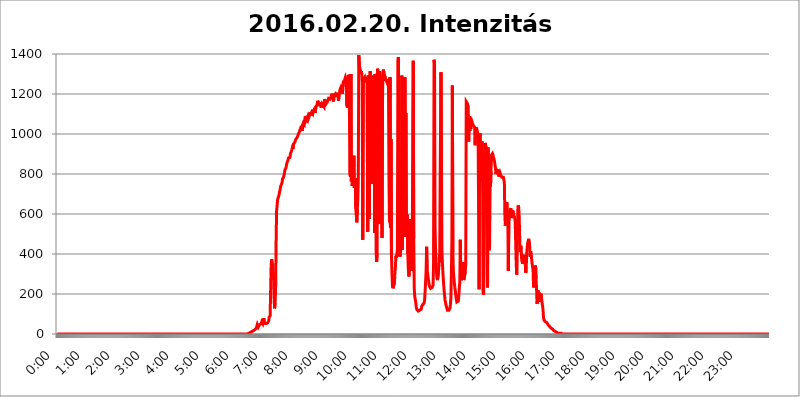
| Category | 2016.02.20. Intenzitás [W/m^2] |
|---|---|
| 0.0 | 0 |
| 0.0006944444444444445 | 0 |
| 0.001388888888888889 | 0 |
| 0.0020833333333333333 | 0 |
| 0.002777777777777778 | 0 |
| 0.003472222222222222 | 0 |
| 0.004166666666666667 | 0 |
| 0.004861111111111111 | 0 |
| 0.005555555555555556 | 0 |
| 0.0062499999999999995 | 0 |
| 0.006944444444444444 | 0 |
| 0.007638888888888889 | 0 |
| 0.008333333333333333 | 0 |
| 0.009027777777777779 | 0 |
| 0.009722222222222222 | 0 |
| 0.010416666666666666 | 0 |
| 0.011111111111111112 | 0 |
| 0.011805555555555555 | 0 |
| 0.012499999999999999 | 0 |
| 0.013194444444444444 | 0 |
| 0.013888888888888888 | 0 |
| 0.014583333333333332 | 0 |
| 0.015277777777777777 | 0 |
| 0.015972222222222224 | 0 |
| 0.016666666666666666 | 0 |
| 0.017361111111111112 | 0 |
| 0.018055555555555557 | 0 |
| 0.01875 | 0 |
| 0.019444444444444445 | 0 |
| 0.02013888888888889 | 0 |
| 0.020833333333333332 | 0 |
| 0.02152777777777778 | 0 |
| 0.022222222222222223 | 0 |
| 0.02291666666666667 | 0 |
| 0.02361111111111111 | 0 |
| 0.024305555555555556 | 0 |
| 0.024999999999999998 | 0 |
| 0.025694444444444447 | 0 |
| 0.02638888888888889 | 0 |
| 0.027083333333333334 | 0 |
| 0.027777777777777776 | 0 |
| 0.02847222222222222 | 0 |
| 0.029166666666666664 | 0 |
| 0.029861111111111113 | 0 |
| 0.030555555555555555 | 0 |
| 0.03125 | 0 |
| 0.03194444444444445 | 0 |
| 0.03263888888888889 | 0 |
| 0.03333333333333333 | 0 |
| 0.034027777777777775 | 0 |
| 0.034722222222222224 | 0 |
| 0.035416666666666666 | 0 |
| 0.036111111111111115 | 0 |
| 0.03680555555555556 | 0 |
| 0.0375 | 0 |
| 0.03819444444444444 | 0 |
| 0.03888888888888889 | 0 |
| 0.03958333333333333 | 0 |
| 0.04027777777777778 | 0 |
| 0.04097222222222222 | 0 |
| 0.041666666666666664 | 0 |
| 0.042361111111111106 | 0 |
| 0.04305555555555556 | 0 |
| 0.043750000000000004 | 0 |
| 0.044444444444444446 | 0 |
| 0.04513888888888889 | 0 |
| 0.04583333333333334 | 0 |
| 0.04652777777777778 | 0 |
| 0.04722222222222222 | 0 |
| 0.04791666666666666 | 0 |
| 0.04861111111111111 | 0 |
| 0.049305555555555554 | 0 |
| 0.049999999999999996 | 0 |
| 0.05069444444444445 | 0 |
| 0.051388888888888894 | 0 |
| 0.052083333333333336 | 0 |
| 0.05277777777777778 | 0 |
| 0.05347222222222222 | 0 |
| 0.05416666666666667 | 0 |
| 0.05486111111111111 | 0 |
| 0.05555555555555555 | 0 |
| 0.05625 | 0 |
| 0.05694444444444444 | 0 |
| 0.057638888888888885 | 0 |
| 0.05833333333333333 | 0 |
| 0.05902777777777778 | 0 |
| 0.059722222222222225 | 0 |
| 0.06041666666666667 | 0 |
| 0.061111111111111116 | 0 |
| 0.06180555555555556 | 0 |
| 0.0625 | 0 |
| 0.06319444444444444 | 0 |
| 0.06388888888888888 | 0 |
| 0.06458333333333334 | 0 |
| 0.06527777777777778 | 0 |
| 0.06597222222222222 | 0 |
| 0.06666666666666667 | 0 |
| 0.06736111111111111 | 0 |
| 0.06805555555555555 | 0 |
| 0.06874999999999999 | 0 |
| 0.06944444444444443 | 0 |
| 0.07013888888888889 | 0 |
| 0.07083333333333333 | 0 |
| 0.07152777777777779 | 0 |
| 0.07222222222222223 | 0 |
| 0.07291666666666667 | 0 |
| 0.07361111111111111 | 0 |
| 0.07430555555555556 | 0 |
| 0.075 | 0 |
| 0.07569444444444444 | 0 |
| 0.0763888888888889 | 0 |
| 0.07708333333333334 | 0 |
| 0.07777777777777778 | 0 |
| 0.07847222222222222 | 0 |
| 0.07916666666666666 | 0 |
| 0.0798611111111111 | 0 |
| 0.08055555555555556 | 0 |
| 0.08125 | 0 |
| 0.08194444444444444 | 0 |
| 0.08263888888888889 | 0 |
| 0.08333333333333333 | 0 |
| 0.08402777777777777 | 0 |
| 0.08472222222222221 | 0 |
| 0.08541666666666665 | 0 |
| 0.08611111111111112 | 0 |
| 0.08680555555555557 | 0 |
| 0.08750000000000001 | 0 |
| 0.08819444444444445 | 0 |
| 0.08888888888888889 | 0 |
| 0.08958333333333333 | 0 |
| 0.09027777777777778 | 0 |
| 0.09097222222222222 | 0 |
| 0.09166666666666667 | 0 |
| 0.09236111111111112 | 0 |
| 0.09305555555555556 | 0 |
| 0.09375 | 0 |
| 0.09444444444444444 | 0 |
| 0.09513888888888888 | 0 |
| 0.09583333333333333 | 0 |
| 0.09652777777777777 | 0 |
| 0.09722222222222222 | 0 |
| 0.09791666666666667 | 0 |
| 0.09861111111111111 | 0 |
| 0.09930555555555555 | 0 |
| 0.09999999999999999 | 0 |
| 0.10069444444444443 | 0 |
| 0.1013888888888889 | 0 |
| 0.10208333333333335 | 0 |
| 0.10277777777777779 | 0 |
| 0.10347222222222223 | 0 |
| 0.10416666666666667 | 0 |
| 0.10486111111111111 | 0 |
| 0.10555555555555556 | 0 |
| 0.10625 | 0 |
| 0.10694444444444444 | 0 |
| 0.1076388888888889 | 0 |
| 0.10833333333333334 | 0 |
| 0.10902777777777778 | 0 |
| 0.10972222222222222 | 0 |
| 0.1111111111111111 | 0 |
| 0.11180555555555556 | 0 |
| 0.11180555555555556 | 0 |
| 0.1125 | 0 |
| 0.11319444444444444 | 0 |
| 0.11388888888888889 | 0 |
| 0.11458333333333333 | 0 |
| 0.11527777777777777 | 0 |
| 0.11597222222222221 | 0 |
| 0.11666666666666665 | 0 |
| 0.1173611111111111 | 0 |
| 0.11805555555555557 | 0 |
| 0.11944444444444445 | 0 |
| 0.12013888888888889 | 0 |
| 0.12083333333333333 | 0 |
| 0.12152777777777778 | 0 |
| 0.12222222222222223 | 0 |
| 0.12291666666666667 | 0 |
| 0.12291666666666667 | 0 |
| 0.12361111111111112 | 0 |
| 0.12430555555555556 | 0 |
| 0.125 | 0 |
| 0.12569444444444444 | 0 |
| 0.12638888888888888 | 0 |
| 0.12708333333333333 | 0 |
| 0.16875 | 0 |
| 0.12847222222222224 | 0 |
| 0.12916666666666668 | 0 |
| 0.12986111111111112 | 0 |
| 0.13055555555555556 | 0 |
| 0.13125 | 0 |
| 0.13194444444444445 | 0 |
| 0.1326388888888889 | 0 |
| 0.13333333333333333 | 0 |
| 0.13402777777777777 | 0 |
| 0.13402777777777777 | 0 |
| 0.13472222222222222 | 0 |
| 0.13541666666666666 | 0 |
| 0.1361111111111111 | 0 |
| 0.13749999999999998 | 0 |
| 0.13819444444444443 | 0 |
| 0.1388888888888889 | 0 |
| 0.13958333333333334 | 0 |
| 0.14027777777777778 | 0 |
| 0.14097222222222222 | 0 |
| 0.14166666666666666 | 0 |
| 0.1423611111111111 | 0 |
| 0.14305555555555557 | 0 |
| 0.14375000000000002 | 0 |
| 0.14444444444444446 | 0 |
| 0.1451388888888889 | 0 |
| 0.1451388888888889 | 0 |
| 0.14652777777777778 | 0 |
| 0.14722222222222223 | 0 |
| 0.14791666666666667 | 0 |
| 0.1486111111111111 | 0 |
| 0.14930555555555555 | 0 |
| 0.15 | 0 |
| 0.15069444444444444 | 0 |
| 0.15138888888888888 | 0 |
| 0.15208333333333332 | 0 |
| 0.15277777777777776 | 0 |
| 0.15347222222222223 | 0 |
| 0.15416666666666667 | 0 |
| 0.15486111111111112 | 0 |
| 0.15555555555555556 | 0 |
| 0.15625 | 0 |
| 0.15694444444444444 | 0 |
| 0.15763888888888888 | 0 |
| 0.15833333333333333 | 0 |
| 0.15902777777777777 | 0 |
| 0.15972222222222224 | 0 |
| 0.16041666666666668 | 0 |
| 0.16111111111111112 | 0 |
| 0.16180555555555556 | 0 |
| 0.1625 | 0 |
| 0.16319444444444445 | 0 |
| 0.1638888888888889 | 0 |
| 0.16458333333333333 | 0 |
| 0.16527777777777777 | 0 |
| 0.16597222222222222 | 0 |
| 0.16666666666666666 | 0 |
| 0.1673611111111111 | 0 |
| 0.16805555555555554 | 0 |
| 0.16874999999999998 | 0 |
| 0.16944444444444443 | 0 |
| 0.17013888888888887 | 0 |
| 0.1708333333333333 | 0 |
| 0.17152777777777775 | 0 |
| 0.17222222222222225 | 0 |
| 0.1729166666666667 | 0 |
| 0.17361111111111113 | 0 |
| 0.17430555555555557 | 0 |
| 0.17500000000000002 | 0 |
| 0.17569444444444446 | 0 |
| 0.1763888888888889 | 0 |
| 0.17708333333333334 | 0 |
| 0.17777777777777778 | 0 |
| 0.17847222222222223 | 0 |
| 0.17916666666666667 | 0 |
| 0.1798611111111111 | 0 |
| 0.18055555555555555 | 0 |
| 0.18125 | 0 |
| 0.18194444444444444 | 0 |
| 0.1826388888888889 | 0 |
| 0.18333333333333335 | 0 |
| 0.1840277777777778 | 0 |
| 0.18472222222222223 | 0 |
| 0.18541666666666667 | 0 |
| 0.18611111111111112 | 0 |
| 0.18680555555555556 | 0 |
| 0.1875 | 0 |
| 0.18819444444444444 | 0 |
| 0.18888888888888888 | 0 |
| 0.18958333333333333 | 0 |
| 0.19027777777777777 | 0 |
| 0.1909722222222222 | 0 |
| 0.19166666666666665 | 0 |
| 0.19236111111111112 | 0 |
| 0.19305555555555554 | 0 |
| 0.19375 | 0 |
| 0.19444444444444445 | 0 |
| 0.1951388888888889 | 0 |
| 0.19583333333333333 | 0 |
| 0.19652777777777777 | 0 |
| 0.19722222222222222 | 0 |
| 0.19791666666666666 | 0 |
| 0.1986111111111111 | 0 |
| 0.19930555555555554 | 0 |
| 0.19999999999999998 | 0 |
| 0.20069444444444443 | 0 |
| 0.20138888888888887 | 0 |
| 0.2020833333333333 | 0 |
| 0.2027777777777778 | 0 |
| 0.2034722222222222 | 0 |
| 0.2041666666666667 | 0 |
| 0.20486111111111113 | 0 |
| 0.20555555555555557 | 0 |
| 0.20625000000000002 | 0 |
| 0.20694444444444446 | 0 |
| 0.2076388888888889 | 0 |
| 0.20833333333333334 | 0 |
| 0.20902777777777778 | 0 |
| 0.20972222222222223 | 0 |
| 0.21041666666666667 | 0 |
| 0.2111111111111111 | 0 |
| 0.21180555555555555 | 0 |
| 0.2125 | 0 |
| 0.21319444444444444 | 0 |
| 0.2138888888888889 | 0 |
| 0.21458333333333335 | 0 |
| 0.2152777777777778 | 0 |
| 0.21597222222222223 | 0 |
| 0.21666666666666667 | 0 |
| 0.21736111111111112 | 0 |
| 0.21805555555555556 | 0 |
| 0.21875 | 0 |
| 0.21944444444444444 | 0 |
| 0.22013888888888888 | 0 |
| 0.22083333333333333 | 0 |
| 0.22152777777777777 | 0 |
| 0.2222222222222222 | 0 |
| 0.22291666666666665 | 0 |
| 0.2236111111111111 | 0 |
| 0.22430555555555556 | 0 |
| 0.225 | 0 |
| 0.22569444444444445 | 0 |
| 0.2263888888888889 | 0 |
| 0.22708333333333333 | 0 |
| 0.22777777777777777 | 0 |
| 0.22847222222222222 | 0 |
| 0.22916666666666666 | 0 |
| 0.2298611111111111 | 0 |
| 0.23055555555555554 | 0 |
| 0.23124999999999998 | 0 |
| 0.23194444444444443 | 0 |
| 0.23263888888888887 | 0 |
| 0.2333333333333333 | 0 |
| 0.2340277777777778 | 0 |
| 0.2347222222222222 | 0 |
| 0.2354166666666667 | 0 |
| 0.23611111111111113 | 0 |
| 0.23680555555555557 | 0 |
| 0.23750000000000002 | 0 |
| 0.23819444444444446 | 0 |
| 0.2388888888888889 | 0 |
| 0.23958333333333334 | 0 |
| 0.24027777777777778 | 0 |
| 0.24097222222222223 | 0 |
| 0.24166666666666667 | 0 |
| 0.2423611111111111 | 0 |
| 0.24305555555555555 | 0 |
| 0.24375 | 0 |
| 0.24444444444444446 | 0 |
| 0.24513888888888888 | 0 |
| 0.24583333333333335 | 0 |
| 0.2465277777777778 | 0 |
| 0.24722222222222223 | 0 |
| 0.24791666666666667 | 0 |
| 0.24861111111111112 | 0 |
| 0.24930555555555556 | 0 |
| 0.25 | 0 |
| 0.25069444444444444 | 0 |
| 0.2513888888888889 | 0 |
| 0.2520833333333333 | 0 |
| 0.25277777777777777 | 0 |
| 0.2534722222222222 | 0 |
| 0.25416666666666665 | 0 |
| 0.2548611111111111 | 0 |
| 0.2555555555555556 | 0 |
| 0.25625000000000003 | 0 |
| 0.2569444444444445 | 0 |
| 0.2576388888888889 | 0 |
| 0.25833333333333336 | 0 |
| 0.2590277777777778 | 0 |
| 0.25972222222222224 | 0 |
| 0.2604166666666667 | 0 |
| 0.2611111111111111 | 0 |
| 0.26180555555555557 | 0 |
| 0.2625 | 0 |
| 0.26319444444444445 | 0 |
| 0.2638888888888889 | 0 |
| 0.26458333333333334 | 0 |
| 0.2652777777777778 | 0 |
| 0.2659722222222222 | 0 |
| 0.26666666666666666 | 0 |
| 0.2673611111111111 | 0 |
| 0.26805555555555555 | 0 |
| 0.26875 | 3.525 |
| 0.26944444444444443 | 3.525 |
| 0.2701388888888889 | 3.525 |
| 0.2708333333333333 | 7.887 |
| 0.27152777777777776 | 7.887 |
| 0.2722222222222222 | 12.257 |
| 0.27291666666666664 | 12.257 |
| 0.2736111111111111 | 12.257 |
| 0.2743055555555555 | 16.636 |
| 0.27499999999999997 | 16.636 |
| 0.27569444444444446 | 16.636 |
| 0.27638888888888885 | 16.636 |
| 0.27708333333333335 | 21.024 |
| 0.2777777777777778 | 21.024 |
| 0.27847222222222223 | 25.419 |
| 0.2791666666666667 | 29.823 |
| 0.2798611111111111 | 38.653 |
| 0.28055555555555556 | 47.511 |
| 0.28125 | 43.079 |
| 0.28194444444444444 | 34.234 |
| 0.2826388888888889 | 34.234 |
| 0.2833333333333333 | 38.653 |
| 0.28402777777777777 | 47.511 |
| 0.2847222222222222 | 47.511 |
| 0.28541666666666665 | 47.511 |
| 0.28611111111111115 | 51.951 |
| 0.28680555555555554 | 60.85 |
| 0.28750000000000003 | 56.398 |
| 0.2881944444444445 | 51.951 |
| 0.2888888888888889 | 65.31 |
| 0.28958333333333336 | 78.722 |
| 0.2902777777777778 | 65.31 |
| 0.29097222222222224 | 51.951 |
| 0.2916666666666667 | 51.951 |
| 0.2923611111111111 | 51.951 |
| 0.29305555555555557 | 51.951 |
| 0.29375 | 56.398 |
| 0.29444444444444445 | 56.398 |
| 0.2951388888888889 | 56.398 |
| 0.29583333333333334 | 56.398 |
| 0.2965277777777778 | 65.31 |
| 0.2972222222222222 | 83.205 |
| 0.29791666666666666 | 87.692 |
| 0.2986111111111111 | 92.184 |
| 0.29930555555555555 | 223.873 |
| 0.3 | 337.639 |
| 0.30069444444444443 | 373.729 |
| 0.3013888888888889 | 360.221 |
| 0.3020833333333333 | 346.682 |
| 0.30277777777777776 | 342.162 |
| 0.3034722222222222 | 269.49 |
| 0.30416666666666664 | 178.264 |
| 0.3048611111111111 | 128.284 |
| 0.3055555555555555 | 155.509 |
| 0.30624999999999997 | 223.873 |
| 0.3069444444444444 | 458.38 |
| 0.3076388888888889 | 613.252 |
| 0.30833333333333335 | 642.4 |
| 0.3090277777777778 | 671.22 |
| 0.30972222222222223 | 679.395 |
| 0.3104166666666667 | 683.473 |
| 0.3111111111111111 | 695.666 |
| 0.31180555555555556 | 711.832 |
| 0.3125 | 719.877 |
| 0.31319444444444444 | 735.89 |
| 0.3138888888888889 | 743.859 |
| 0.3145833333333333 | 747.834 |
| 0.31527777777777777 | 755.766 |
| 0.3159722222222222 | 775.492 |
| 0.31666666666666665 | 775.492 |
| 0.31736111111111115 | 783.342 |
| 0.31805555555555554 | 795.074 |
| 0.31875000000000003 | 806.757 |
| 0.3194444444444445 | 822.26 |
| 0.3201388888888889 | 826.123 |
| 0.32083333333333336 | 829.981 |
| 0.3215277777777778 | 845.365 |
| 0.32222222222222224 | 856.855 |
| 0.3229166666666667 | 856.855 |
| 0.3236111111111111 | 868.305 |
| 0.32430555555555557 | 879.719 |
| 0.325 | 883.516 |
| 0.32569444444444445 | 879.719 |
| 0.3263888888888889 | 883.516 |
| 0.32708333333333334 | 902.447 |
| 0.3277777777777778 | 902.447 |
| 0.3284722222222222 | 913.766 |
| 0.32916666666666666 | 917.534 |
| 0.3298611111111111 | 932.576 |
| 0.33055555555555555 | 925.06 |
| 0.33125 | 947.58 |
| 0.33194444444444443 | 947.58 |
| 0.3326388888888889 | 951.327 |
| 0.3333333333333333 | 958.814 |
| 0.3340277777777778 | 970.034 |
| 0.3347222222222222 | 970.034 |
| 0.3354166666666667 | 977.508 |
| 0.3361111111111111 | 973.772 |
| 0.3368055555555556 | 984.98 |
| 0.33749999999999997 | 992.448 |
| 0.33819444444444446 | 999.916 |
| 0.33888888888888885 | 999.916 |
| 0.33958333333333335 | 1011.118 |
| 0.34027777777777773 | 1018.587 |
| 0.34097222222222223 | 1014.852 |
| 0.3416666666666666 | 1022.323 |
| 0.3423611111111111 | 1041.019 |
| 0.3430555555555555 | 1022.323 |
| 0.34375 | 1014.852 |
| 0.3444444444444445 | 1048.508 |
| 0.3451388888888889 | 1056.004 |
| 0.3458333333333334 | 1052.255 |
| 0.34652777777777777 | 1048.508 |
| 0.34722222222222227 | 1071.027 |
| 0.34791666666666665 | 1089.873 |
| 0.34861111111111115 | 1086.097 |
| 0.34930555555555554 | 1086.097 |
| 0.35000000000000003 | 1071.027 |
| 0.3506944444444444 | 1078.555 |
| 0.3513888888888889 | 1086.097 |
| 0.3520833333333333 | 1074.789 |
| 0.3527777777777778 | 1082.324 |
| 0.3534722222222222 | 1089.873 |
| 0.3541666666666667 | 1101.226 |
| 0.3548611111111111 | 1108.816 |
| 0.35555555555555557 | 1093.653 |
| 0.35625 | 1093.653 |
| 0.35694444444444445 | 1108.816 |
| 0.3576388888888889 | 1108.816 |
| 0.35833333333333334 | 1101.226 |
| 0.3590277777777778 | 1116.426 |
| 0.3597222222222222 | 1116.426 |
| 0.36041666666666666 | 1124.056 |
| 0.3611111111111111 | 1124.056 |
| 0.36180555555555555 | 1105.019 |
| 0.3625 | 1127.879 |
| 0.36319444444444443 | 1139.384 |
| 0.3638888888888889 | 1135.543 |
| 0.3645833333333333 | 1147.086 |
| 0.3652777777777778 | 1166.46 |
| 0.3659722222222222 | 1158.689 |
| 0.3666666666666667 | 1147.086 |
| 0.3673611111111111 | 1147.086 |
| 0.3680555555555556 | 1143.232 |
| 0.36874999999999997 | 1150.946 |
| 0.36944444444444446 | 1147.086 |
| 0.37013888888888885 | 1131.708 |
| 0.37083333333333335 | 1131.708 |
| 0.37152777777777773 | 1150.946 |
| 0.37222222222222223 | 1150.946 |
| 0.3729166666666666 | 1143.232 |
| 0.3736111111111111 | 1139.384 |
| 0.3743055555555555 | 1135.543 |
| 0.375 | 1174.263 |
| 0.3756944444444445 | 1178.177 |
| 0.3763888888888889 | 1174.263 |
| 0.3770833333333334 | 1150.946 |
| 0.37777777777777777 | 1150.946 |
| 0.37847222222222227 | 1150.946 |
| 0.37916666666666665 | 1162.571 |
| 0.37986111111111115 | 1158.689 |
| 0.38055555555555554 | 1178.177 |
| 0.38125000000000003 | 1178.177 |
| 0.3819444444444444 | 1174.263 |
| 0.3826388888888889 | 1174.263 |
| 0.3833333333333333 | 1174.263 |
| 0.3840277777777778 | 1186.03 |
| 0.3847222222222222 | 1193.918 |
| 0.3854166666666667 | 1201.843 |
| 0.3861111111111111 | 1189.969 |
| 0.38680555555555557 | 1170.358 |
| 0.3875 | 1162.571 |
| 0.38819444444444445 | 1193.918 |
| 0.3888888888888889 | 1197.876 |
| 0.38958333333333334 | 1189.969 |
| 0.3902777777777778 | 1201.843 |
| 0.3909722222222222 | 1205.82 |
| 0.39166666666666666 | 1193.918 |
| 0.3923611111111111 | 1186.03 |
| 0.39305555555555555 | 1205.82 |
| 0.39375 | 1189.969 |
| 0.39444444444444443 | 1166.46 |
| 0.3951388888888889 | 1193.918 |
| 0.3958333333333333 | 1201.843 |
| 0.3965277777777778 | 1221.83 |
| 0.3972222222222222 | 1225.859 |
| 0.3979166666666667 | 1233.951 |
| 0.3986111111111111 | 1225.859 |
| 0.3993055555555556 | 1217.812 |
| 0.39999999999999997 | 1201.843 |
| 0.40069444444444446 | 1242.089 |
| 0.40138888888888885 | 1266.8 |
| 0.40208333333333335 | 1258.511 |
| 0.40277777777777773 | 1262.649 |
| 0.40347222222222223 | 1275.142 |
| 0.4041666666666666 | 1283.541 |
| 0.4048611111111111 | 1275.142 |
| 0.4055555555555555 | 1283.541 |
| 0.40625 | 1139.384 |
| 0.4069444444444445 | 1131.708 |
| 0.4076388888888889 | 1275.142 |
| 0.4083333333333334 | 1296.248 |
| 0.40902777777777777 | 1287.761 |
| 0.40972222222222227 | 1150.946 |
| 0.41041666666666665 | 806.757 |
| 0.41111111111111115 | 787.258 |
| 0.41180555555555554 | 1300.514 |
| 0.41250000000000003 | 763.674 |
| 0.4131944444444444 | 868.305 |
| 0.4138888888888889 | 739.877 |
| 0.4145833333333333 | 856.855 |
| 0.4152777777777778 | 763.674 |
| 0.4159722222222222 | 891.099 |
| 0.4166666666666667 | 731.896 |
| 0.4173611111111111 | 767.62 |
| 0.41805555555555557 | 779.42 |
| 0.41875 | 625.784 |
| 0.41944444444444445 | 592.233 |
| 0.4201388888888889 | 558.261 |
| 0.42083333333333334 | 625.784 |
| 0.4215277777777778 | 671.22 |
| 0.4222222222222222 | 771.559 |
| 0.42291666666666666 | 1394.106 |
| 0.4236111111111111 | 1344.072 |
| 0.42430555555555555 | 1330.826 |
| 0.425 | 1322.082 |
| 0.42569444444444443 | 1304.795 |
| 0.4263888888888889 | 1313.406 |
| 0.4270833333333333 | 1300.514 |
| 0.4277777777777778 | 1258.511 |
| 0.4284722222222222 | 471.582 |
| 0.4291666666666667 | 1262.649 |
| 0.4298611111111111 | 1275.142 |
| 0.4305555555555556 | 1279.334 |
| 0.43124999999999997 | 1283.541 |
| 0.43194444444444446 | 1270.964 |
| 0.43263888888888885 | 1258.511 |
| 0.43333333333333335 | 1283.541 |
| 0.43402777777777773 | 1270.964 |
| 0.43472222222222223 | 1279.334 |
| 0.4354166666666666 | 510.885 |
| 0.4361111111111111 | 1291.997 |
| 0.4368055555555555 | 1270.964 |
| 0.4375 | 575.299 |
| 0.4381944444444445 | 1225.859 |
| 0.4388888888888889 | 1313.406 |
| 0.4395833333333334 | 1258.511 |
| 0.44027777777777777 | 1258.511 |
| 0.44097222222222227 | 751.803 |
| 0.44166666666666665 | 1254.387 |
| 0.44236111111111115 | 1291.997 |
| 0.44305555555555554 | 1296.248 |
| 0.44375000000000003 | 1246.176 |
| 0.4444444444444444 | 1283.541 |
| 0.4451388888888889 | 506.542 |
| 0.4458333333333333 | 1300.514 |
| 0.4465277777777778 | 1279.334 |
| 0.4472222222222222 | 414.035 |
| 0.4479166666666667 | 360.221 |
| 0.4486111111111111 | 400.638 |
| 0.44930555555555557 | 1326.445 |
| 0.45 | 1300.514 |
| 0.45069444444444445 | 600.661 |
| 0.4513888888888889 | 549.704 |
| 0.45208333333333334 | 1313.406 |
| 0.4527777777777778 | 1317.736 |
| 0.4534722222222222 | 1275.142 |
| 0.45416666666666666 | 1178.177 |
| 0.4548611111111111 | 751.803 |
| 0.45555555555555555 | 480.356 |
| 0.45625 | 1209.807 |
| 0.45694444444444443 | 1313.406 |
| 0.4576388888888889 | 1322.082 |
| 0.4583333333333333 | 1270.964 |
| 0.4590277777777778 | 1296.248 |
| 0.4597222222222222 | 1266.8 |
| 0.4604166666666667 | 1279.334 |
| 0.4611111111111111 | 1279.334 |
| 0.4618055555555556 | 1275.142 |
| 0.46249999999999997 | 1258.511 |
| 0.46319444444444446 | 1262.649 |
| 0.46388888888888885 | 1275.142 |
| 0.46458333333333335 | 1262.649 |
| 0.46527777777777773 | 771.559 |
| 0.46597222222222223 | 558.261 |
| 0.4666666666666666 | 1283.541 |
| 0.4673611111111111 | 532.513 |
| 0.4680555555555555 | 973.772 |
| 0.46875 | 396.164 |
| 0.4694444444444445 | 305.898 |
| 0.4701388888888889 | 242.127 |
| 0.4708333333333334 | 228.436 |
| 0.47152777777777777 | 233 |
| 0.47222222222222227 | 228.436 |
| 0.47291666666666665 | 255.813 |
| 0.47361111111111115 | 305.898 |
| 0.47430555555555554 | 337.639 |
| 0.47500000000000003 | 391.685 |
| 0.4756944444444444 | 382.715 |
| 0.4763888888888889 | 396.164 |
| 0.4770833333333333 | 427.39 |
| 0.4777777777777778 | 1361.991 |
| 0.4784722222222222 | 1384.828 |
| 0.4791666666666667 | 409.574 |
| 0.4798611111111111 | 427.39 |
| 0.48055555555555557 | 387.202 |
| 0.48125 | 400.638 |
| 0.48194444444444445 | 427.39 |
| 0.4826388888888889 | 523.88 |
| 0.48333333333333334 | 1291.997 |
| 0.4840277777777778 | 422.943 |
| 0.4847222222222222 | 418.492 |
| 0.48541666666666666 | 1108.816 |
| 0.4861111111111111 | 917.534 |
| 0.48680555555555555 | 484.735 |
| 0.4875 | 1283.541 |
| 0.48819444444444443 | 609.062 |
| 0.4888888888888889 | 1105.019 |
| 0.4895833333333333 | 592.233 |
| 0.4902777777777778 | 502.192 |
| 0.4909722222222222 | 596.45 |
| 0.4916666666666667 | 400.638 |
| 0.4923611111111111 | 328.584 |
| 0.4930555555555556 | 287.709 |
| 0.49374999999999997 | 305.898 |
| 0.49444444444444446 | 427.39 |
| 0.49513888888888885 | 575.299 |
| 0.49583333333333335 | 364.728 |
| 0.49652777777777773 | 342.162 |
| 0.49722222222222223 | 314.98 |
| 0.4979166666666666 | 337.639 |
| 0.4986111111111111 | 1067.267 |
| 0.4993055555555555 | 1366.519 |
| 0.5 | 480.356 |
| 0.5006944444444444 | 228.436 |
| 0.5013888888888889 | 187.378 |
| 0.5020833333333333 | 173.709 |
| 0.5027777777777778 | 160.056 |
| 0.5034722222222222 | 137.347 |
| 0.5041666666666667 | 123.758 |
| 0.5048611111111111 | 119.235 |
| 0.5055555555555555 | 119.235 |
| 0.50625 | 114.716 |
| 0.5069444444444444 | 119.235 |
| 0.5076388888888889 | 119.235 |
| 0.5083333333333333 | 119.235 |
| 0.5090277777777777 | 119.235 |
| 0.5097222222222222 | 119.235 |
| 0.5104166666666666 | 123.758 |
| 0.5111111111111112 | 137.347 |
| 0.5118055555555555 | 141.884 |
| 0.5125000000000001 | 146.423 |
| 0.5131944444444444 | 146.423 |
| 0.513888888888889 | 150.964 |
| 0.5145833333333333 | 155.509 |
| 0.5152777777777778 | 173.709 |
| 0.5159722222222222 | 214.746 |
| 0.5166666666666667 | 264.932 |
| 0.517361111111111 | 319.517 |
| 0.5180555555555556 | 436.27 |
| 0.5187499999999999 | 314.98 |
| 0.5194444444444445 | 305.898 |
| 0.5201388888888888 | 283.156 |
| 0.5208333333333334 | 264.932 |
| 0.5215277777777778 | 246.689 |
| 0.5222222222222223 | 237.564 |
| 0.5229166666666667 | 242.127 |
| 0.5236111111111111 | 228.436 |
| 0.5243055555555556 | 223.873 |
| 0.525 | 233 |
| 0.5256944444444445 | 233 |
| 0.5263888888888889 | 228.436 |
| 0.5270833333333333 | 242.127 |
| 0.5277777777777778 | 355.712 |
| 0.5284722222222222 | 1371.066 |
| 0.5291666666666667 | 1352.994 |
| 0.5298611111111111 | 536.82 |
| 0.5305555555555556 | 431.833 |
| 0.53125 | 360.221 |
| 0.5319444444444444 | 305.898 |
| 0.5326388888888889 | 278.603 |
| 0.5333333333333333 | 269.49 |
| 0.5340277777777778 | 274.047 |
| 0.5347222222222222 | 314.98 |
| 0.5354166666666667 | 342.162 |
| 0.5361111111111111 | 396.164 |
| 0.5368055555555555 | 360.221 |
| 0.5375 | 984.98 |
| 0.5381944444444444 | 1309.093 |
| 0.5388888888888889 | 802.868 |
| 0.5395833333333333 | 409.574 |
| 0.5402777777777777 | 351.198 |
| 0.5409722222222222 | 301.354 |
| 0.5416666666666666 | 264.932 |
| 0.5423611111111112 | 228.436 |
| 0.5430555555555555 | 201.058 |
| 0.5437500000000001 | 173.709 |
| 0.5444444444444444 | 160.056 |
| 0.545138888888889 | 146.423 |
| 0.5458333333333333 | 137.347 |
| 0.5465277777777778 | 128.284 |
| 0.5472222222222222 | 119.235 |
| 0.5479166666666667 | 119.235 |
| 0.548611111111111 | 119.235 |
| 0.5493055555555556 | 119.235 |
| 0.5499999999999999 | 119.235 |
| 0.5506944444444445 | 128.284 |
| 0.5513888888888888 | 146.423 |
| 0.5520833333333334 | 178.264 |
| 0.5527777777777778 | 296.808 |
| 0.5534722222222223 | 462.786 |
| 0.5541666666666667 | 1242.089 |
| 0.5548611111111111 | 409.574 |
| 0.5555555555555556 | 314.98 |
| 0.55625 | 283.156 |
| 0.5569444444444445 | 255.813 |
| 0.5576388888888889 | 233 |
| 0.5583333333333333 | 214.746 |
| 0.5590277777777778 | 191.937 |
| 0.5597222222222222 | 173.709 |
| 0.5604166666666667 | 160.056 |
| 0.5611111111111111 | 155.509 |
| 0.5618055555555556 | 155.509 |
| 0.5625 | 164.605 |
| 0.5631944444444444 | 191.937 |
| 0.5638888888888889 | 228.436 |
| 0.5645833333333333 | 260.373 |
| 0.5652777777777778 | 471.582 |
| 0.5659722222222222 | 292.259 |
| 0.5666666666666667 | 269.49 |
| 0.5673611111111111 | 278.603 |
| 0.5680555555555555 | 278.603 |
| 0.56875 | 274.047 |
| 0.5694444444444444 | 360.221 |
| 0.5701388888888889 | 269.49 |
| 0.5708333333333333 | 269.49 |
| 0.5715277777777777 | 274.047 |
| 0.5722222222222222 | 310.44 |
| 0.5729166666666666 | 351.198 |
| 0.5736111111111112 | 1162.571 |
| 0.5743055555555555 | 1166.46 |
| 0.5750000000000001 | 1154.814 |
| 0.5756944444444444 | 1154.814 |
| 0.576388888888889 | 1139.384 |
| 0.5770833333333333 | 962.555 |
| 0.5777777777777778 | 1089.873 |
| 0.5784722222222222 | 1014.852 |
| 0.5791666666666667 | 1078.555 |
| 0.579861111111111 | 1026.06 |
| 0.5805555555555556 | 1059.756 |
| 0.5812499999999999 | 1067.267 |
| 0.5819444444444445 | 1059.756 |
| 0.5826388888888888 | 1048.508 |
| 0.5833333333333334 | 1044.762 |
| 0.5840277777777778 | 1041.019 |
| 0.5847222222222223 | 1037.277 |
| 0.5854166666666667 | 1033.537 |
| 0.5861111111111111 | 943.832 |
| 0.5868055555555556 | 1033.537 |
| 0.5875 | 1011.118 |
| 0.5881944444444445 | 1014.852 |
| 0.5888888888888889 | 1018.587 |
| 0.5895833333333333 | 1007.383 |
| 0.5902777777777778 | 999.916 |
| 0.5909722222222222 | 617.436 |
| 0.5916666666666667 | 223.873 |
| 0.5923611111111111 | 984.98 |
| 0.5930555555555556 | 1003.65 |
| 0.59375 | 759.723 |
| 0.5944444444444444 | 947.58 |
| 0.5951388888888889 | 925.06 |
| 0.5958333333333333 | 962.555 |
| 0.5965277777777778 | 845.365 |
| 0.5972222222222222 | 205.62 |
| 0.5979166666666667 | 196.497 |
| 0.5986111111111111 | 201.058 |
| 0.5993055555555555 | 763.674 |
| 0.6 | 955.071 |
| 0.6006944444444444 | 947.58 |
| 0.6013888888888889 | 936.33 |
| 0.6020833333333333 | 932.576 |
| 0.6027777777777777 | 917.534 |
| 0.6034722222222222 | 233 |
| 0.6041666666666666 | 932.576 |
| 0.6048611111111112 | 719.877 |
| 0.6055555555555555 | 621.613 |
| 0.6062500000000001 | 418.492 |
| 0.6069444444444444 | 879.719 |
| 0.607638888888889 | 735.89 |
| 0.6083333333333333 | 814.519 |
| 0.6090277777777778 | 894.885 |
| 0.6097222222222222 | 891.099 |
| 0.6104166666666667 | 902.447 |
| 0.611111111111111 | 894.885 |
| 0.6118055555555556 | 894.885 |
| 0.6124999999999999 | 875.918 |
| 0.6131944444444445 | 864.493 |
| 0.6138888888888888 | 864.493 |
| 0.6145833333333334 | 829.981 |
| 0.6152777777777778 | 798.974 |
| 0.6159722222222223 | 802.868 |
| 0.6166666666666667 | 818.392 |
| 0.6173611111111111 | 814.519 |
| 0.6180555555555556 | 810.641 |
| 0.61875 | 822.26 |
| 0.6194444444444445 | 787.258 |
| 0.6201388888888889 | 798.974 |
| 0.6208333333333333 | 806.757 |
| 0.6215277777777778 | 798.974 |
| 0.6222222222222222 | 798.974 |
| 0.6229166666666667 | 795.074 |
| 0.6236111111111111 | 783.342 |
| 0.6243055555555556 | 783.342 |
| 0.625 | 787.258 |
| 0.6256944444444444 | 783.342 |
| 0.6263888888888889 | 771.559 |
| 0.6270833333333333 | 755.766 |
| 0.6277777777777778 | 596.45 |
| 0.6284722222222222 | 541.121 |
| 0.6291666666666667 | 566.793 |
| 0.6298611111111111 | 617.436 |
| 0.6305555555555555 | 658.909 |
| 0.63125 | 600.661 |
| 0.6319444444444444 | 588.009 |
| 0.6326388888888889 | 314.98 |
| 0.6333333333333333 | 553.986 |
| 0.6340277777777777 | 579.542 |
| 0.6347222222222222 | 592.233 |
| 0.6354166666666666 | 592.233 |
| 0.6361111111111112 | 629.948 |
| 0.6368055555555555 | 592.233 |
| 0.6375000000000001 | 579.542 |
| 0.6381944444444444 | 579.542 |
| 0.638888888888889 | 617.436 |
| 0.6395833333333333 | 617.436 |
| 0.6402777777777778 | 592.233 |
| 0.6409722222222222 | 588.009 |
| 0.6416666666666667 | 583.779 |
| 0.642361111111111 | 553.986 |
| 0.6430555555555556 | 445.129 |
| 0.6437499999999999 | 346.682 |
| 0.6444444444444445 | 296.808 |
| 0.6451388888888888 | 566.793 |
| 0.6458333333333334 | 545.416 |
| 0.6465277777777778 | 642.4 |
| 0.6472222222222223 | 634.105 |
| 0.6479166666666667 | 583.779 |
| 0.6486111111111111 | 471.582 |
| 0.6493055555555556 | 409.574 |
| 0.65 | 440.702 |
| 0.6506944444444445 | 427.39 |
| 0.6513888888888889 | 369.23 |
| 0.6520833333333333 | 364.728 |
| 0.6527777777777778 | 351.198 |
| 0.6534722222222222 | 364.728 |
| 0.6541666666666667 | 382.715 |
| 0.6548611111111111 | 382.715 |
| 0.6555555555555556 | 396.164 |
| 0.65625 | 369.23 |
| 0.6569444444444444 | 305.898 |
| 0.6576388888888889 | 314.98 |
| 0.6583333333333333 | 396.164 |
| 0.6590277777777778 | 427.39 |
| 0.6597222222222222 | 453.968 |
| 0.6604166666666667 | 462.786 |
| 0.6611111111111111 | 475.972 |
| 0.6618055555555555 | 471.582 |
| 0.6625 | 440.702 |
| 0.6631944444444444 | 387.202 |
| 0.6638888888888889 | 414.035 |
| 0.6645833333333333 | 418.492 |
| 0.6652777777777777 | 378.224 |
| 0.6659722222222222 | 351.198 |
| 0.6666666666666666 | 337.639 |
| 0.6673611111111111 | 319.517 |
| 0.6680555555555556 | 233 |
| 0.6687500000000001 | 233 |
| 0.6694444444444444 | 233 |
| 0.6701388888888888 | 301.354 |
| 0.6708333333333334 | 342.162 |
| 0.6715277777777778 | 274.047 |
| 0.6722222222222222 | 228.436 |
| 0.6729166666666666 | 150.964 |
| 0.6736111111111112 | 169.156 |
| 0.6743055555555556 | 219.309 |
| 0.6749999999999999 | 182.82 |
| 0.6756944444444444 | 160.056 |
| 0.6763888888888889 | 205.62 |
| 0.6770833333333334 | 201.058 |
| 0.6777777777777777 | 191.937 |
| 0.6784722222222223 | 201.058 |
| 0.6791666666666667 | 182.82 |
| 0.6798611111111111 | 160.056 |
| 0.6805555555555555 | 155.509 |
| 0.68125 | 123.758 |
| 0.6819444444444445 | 83.205 |
| 0.6826388888888889 | 69.775 |
| 0.6833333333333332 | 65.31 |
| 0.6840277777777778 | 65.31 |
| 0.6847222222222222 | 60.85 |
| 0.6854166666666667 | 56.398 |
| 0.686111111111111 | 56.398 |
| 0.6868055555555556 | 56.398 |
| 0.6875 | 51.951 |
| 0.6881944444444444 | 47.511 |
| 0.688888888888889 | 43.079 |
| 0.6895833333333333 | 43.079 |
| 0.6902777777777778 | 38.653 |
| 0.6909722222222222 | 34.234 |
| 0.6916666666666668 | 34.234 |
| 0.6923611111111111 | 29.823 |
| 0.6930555555555555 | 29.823 |
| 0.69375 | 25.419 |
| 0.6944444444444445 | 25.419 |
| 0.6951388888888889 | 21.024 |
| 0.6958333333333333 | 21.024 |
| 0.6965277777777777 | 16.636 |
| 0.6972222222222223 | 16.636 |
| 0.6979166666666666 | 12.257 |
| 0.6986111111111111 | 12.257 |
| 0.6993055555555556 | 12.257 |
| 0.7000000000000001 | 7.887 |
| 0.7006944444444444 | 7.887 |
| 0.7013888888888888 | 7.887 |
| 0.7020833333333334 | 7.887 |
| 0.7027777777777778 | 3.525 |
| 0.7034722222222222 | 3.525 |
| 0.7041666666666666 | 3.525 |
| 0.7048611111111112 | 3.525 |
| 0.7055555555555556 | 3.525 |
| 0.7062499999999999 | 3.525 |
| 0.7069444444444444 | 3.525 |
| 0.7076388888888889 | 3.525 |
| 0.7083333333333334 | 0 |
| 0.7090277777777777 | 0 |
| 0.7097222222222223 | 0 |
| 0.7104166666666667 | 0 |
| 0.7111111111111111 | 0 |
| 0.7118055555555555 | 0 |
| 0.7125 | 0 |
| 0.7131944444444445 | 0 |
| 0.7138888888888889 | 0 |
| 0.7145833333333332 | 0 |
| 0.7152777777777778 | 0 |
| 0.7159722222222222 | 0 |
| 0.7166666666666667 | 0 |
| 0.717361111111111 | 0 |
| 0.7180555555555556 | 0 |
| 0.71875 | 0 |
| 0.7194444444444444 | 0 |
| 0.720138888888889 | 0 |
| 0.7208333333333333 | 0 |
| 0.7215277777777778 | 0 |
| 0.7222222222222222 | 0 |
| 0.7229166666666668 | 0 |
| 0.7236111111111111 | 0 |
| 0.7243055555555555 | 0 |
| 0.725 | 0 |
| 0.7256944444444445 | 0 |
| 0.7263888888888889 | 0 |
| 0.7270833333333333 | 0 |
| 0.7277777777777777 | 0 |
| 0.7284722222222223 | 0 |
| 0.7291666666666666 | 0 |
| 0.7298611111111111 | 0 |
| 0.7305555555555556 | 0 |
| 0.7312500000000001 | 0 |
| 0.7319444444444444 | 0 |
| 0.7326388888888888 | 0 |
| 0.7333333333333334 | 0 |
| 0.7340277777777778 | 0 |
| 0.7347222222222222 | 0 |
| 0.7354166666666666 | 0 |
| 0.7361111111111112 | 0 |
| 0.7368055555555556 | 0 |
| 0.7374999999999999 | 0 |
| 0.7381944444444444 | 0 |
| 0.7388888888888889 | 0 |
| 0.7395833333333334 | 0 |
| 0.7402777777777777 | 0 |
| 0.7409722222222223 | 0 |
| 0.7416666666666667 | 0 |
| 0.7423611111111111 | 0 |
| 0.7430555555555555 | 0 |
| 0.74375 | 0 |
| 0.7444444444444445 | 0 |
| 0.7451388888888889 | 0 |
| 0.7458333333333332 | 0 |
| 0.7465277777777778 | 0 |
| 0.7472222222222222 | 0 |
| 0.7479166666666667 | 0 |
| 0.748611111111111 | 0 |
| 0.7493055555555556 | 0 |
| 0.75 | 0 |
| 0.7506944444444444 | 0 |
| 0.751388888888889 | 0 |
| 0.7520833333333333 | 0 |
| 0.7527777777777778 | 0 |
| 0.7534722222222222 | 0 |
| 0.7541666666666668 | 0 |
| 0.7548611111111111 | 0 |
| 0.7555555555555555 | 0 |
| 0.75625 | 0 |
| 0.7569444444444445 | 0 |
| 0.7576388888888889 | 0 |
| 0.7583333333333333 | 0 |
| 0.7590277777777777 | 0 |
| 0.7597222222222223 | 0 |
| 0.7604166666666666 | 0 |
| 0.7611111111111111 | 0 |
| 0.7618055555555556 | 0 |
| 0.7625000000000001 | 0 |
| 0.7631944444444444 | 0 |
| 0.7638888888888888 | 0 |
| 0.7645833333333334 | 0 |
| 0.7652777777777778 | 0 |
| 0.7659722222222222 | 0 |
| 0.7666666666666666 | 0 |
| 0.7673611111111112 | 0 |
| 0.7680555555555556 | 0 |
| 0.7687499999999999 | 0 |
| 0.7694444444444444 | 0 |
| 0.7701388888888889 | 0 |
| 0.7708333333333334 | 0 |
| 0.7715277777777777 | 0 |
| 0.7722222222222223 | 0 |
| 0.7729166666666667 | 0 |
| 0.7736111111111111 | 0 |
| 0.7743055555555555 | 0 |
| 0.775 | 0 |
| 0.7756944444444445 | 0 |
| 0.7763888888888889 | 0 |
| 0.7770833333333332 | 0 |
| 0.7777777777777778 | 0 |
| 0.7784722222222222 | 0 |
| 0.7791666666666667 | 0 |
| 0.779861111111111 | 0 |
| 0.7805555555555556 | 0 |
| 0.78125 | 0 |
| 0.7819444444444444 | 0 |
| 0.782638888888889 | 0 |
| 0.7833333333333333 | 0 |
| 0.7840277777777778 | 0 |
| 0.7847222222222222 | 0 |
| 0.7854166666666668 | 0 |
| 0.7861111111111111 | 0 |
| 0.7868055555555555 | 0 |
| 0.7875 | 0 |
| 0.7881944444444445 | 0 |
| 0.7888888888888889 | 0 |
| 0.7895833333333333 | 0 |
| 0.7902777777777777 | 0 |
| 0.7909722222222223 | 0 |
| 0.7916666666666666 | 0 |
| 0.7923611111111111 | 0 |
| 0.7930555555555556 | 0 |
| 0.7937500000000001 | 0 |
| 0.7944444444444444 | 0 |
| 0.7951388888888888 | 0 |
| 0.7958333333333334 | 0 |
| 0.7965277777777778 | 0 |
| 0.7972222222222222 | 0 |
| 0.7979166666666666 | 0 |
| 0.7986111111111112 | 0 |
| 0.7993055555555556 | 0 |
| 0.7999999999999999 | 0 |
| 0.8006944444444444 | 0 |
| 0.8013888888888889 | 0 |
| 0.8020833333333334 | 0 |
| 0.8027777777777777 | 0 |
| 0.8034722222222223 | 0 |
| 0.8041666666666667 | 0 |
| 0.8048611111111111 | 0 |
| 0.8055555555555555 | 0 |
| 0.80625 | 0 |
| 0.8069444444444445 | 0 |
| 0.8076388888888889 | 0 |
| 0.8083333333333332 | 0 |
| 0.8090277777777778 | 0 |
| 0.8097222222222222 | 0 |
| 0.8104166666666667 | 0 |
| 0.811111111111111 | 0 |
| 0.8118055555555556 | 0 |
| 0.8125 | 0 |
| 0.8131944444444444 | 0 |
| 0.813888888888889 | 0 |
| 0.8145833333333333 | 0 |
| 0.8152777777777778 | 0 |
| 0.8159722222222222 | 0 |
| 0.8166666666666668 | 0 |
| 0.8173611111111111 | 0 |
| 0.8180555555555555 | 0 |
| 0.81875 | 0 |
| 0.8194444444444445 | 0 |
| 0.8201388888888889 | 0 |
| 0.8208333333333333 | 0 |
| 0.8215277777777777 | 0 |
| 0.8222222222222223 | 0 |
| 0.8229166666666666 | 0 |
| 0.8236111111111111 | 0 |
| 0.8243055555555556 | 0 |
| 0.8250000000000001 | 0 |
| 0.8256944444444444 | 0 |
| 0.8263888888888888 | 0 |
| 0.8270833333333334 | 0 |
| 0.8277777777777778 | 0 |
| 0.8284722222222222 | 0 |
| 0.8291666666666666 | 0 |
| 0.8298611111111112 | 0 |
| 0.8305555555555556 | 0 |
| 0.8312499999999999 | 0 |
| 0.8319444444444444 | 0 |
| 0.8326388888888889 | 0 |
| 0.8333333333333334 | 0 |
| 0.8340277777777777 | 0 |
| 0.8347222222222223 | 0 |
| 0.8354166666666667 | 0 |
| 0.8361111111111111 | 0 |
| 0.8368055555555555 | 0 |
| 0.8375 | 0 |
| 0.8381944444444445 | 0 |
| 0.8388888888888889 | 0 |
| 0.8395833333333332 | 0 |
| 0.8402777777777778 | 0 |
| 0.8409722222222222 | 0 |
| 0.8416666666666667 | 0 |
| 0.842361111111111 | 0 |
| 0.8430555555555556 | 0 |
| 0.84375 | 0 |
| 0.8444444444444444 | 0 |
| 0.845138888888889 | 0 |
| 0.8458333333333333 | 0 |
| 0.8465277777777778 | 0 |
| 0.8472222222222222 | 0 |
| 0.8479166666666668 | 0 |
| 0.8486111111111111 | 0 |
| 0.8493055555555555 | 0 |
| 0.85 | 0 |
| 0.8506944444444445 | 0 |
| 0.8513888888888889 | 0 |
| 0.8520833333333333 | 0 |
| 0.8527777777777777 | 0 |
| 0.8534722222222223 | 0 |
| 0.8541666666666666 | 0 |
| 0.8548611111111111 | 0 |
| 0.8555555555555556 | 0 |
| 0.8562500000000001 | 0 |
| 0.8569444444444444 | 0 |
| 0.8576388888888888 | 0 |
| 0.8583333333333334 | 0 |
| 0.8590277777777778 | 0 |
| 0.8597222222222222 | 0 |
| 0.8604166666666666 | 0 |
| 0.8611111111111112 | 0 |
| 0.8618055555555556 | 0 |
| 0.8624999999999999 | 0 |
| 0.8631944444444444 | 0 |
| 0.8638888888888889 | 0 |
| 0.8645833333333334 | 0 |
| 0.8652777777777777 | 0 |
| 0.8659722222222223 | 0 |
| 0.8666666666666667 | 0 |
| 0.8673611111111111 | 0 |
| 0.8680555555555555 | 0 |
| 0.86875 | 0 |
| 0.8694444444444445 | 0 |
| 0.8701388888888889 | 0 |
| 0.8708333333333332 | 0 |
| 0.8715277777777778 | 0 |
| 0.8722222222222222 | 0 |
| 0.8729166666666667 | 0 |
| 0.873611111111111 | 0 |
| 0.8743055555555556 | 0 |
| 0.875 | 0 |
| 0.8756944444444444 | 0 |
| 0.876388888888889 | 0 |
| 0.8770833333333333 | 0 |
| 0.8777777777777778 | 0 |
| 0.8784722222222222 | 0 |
| 0.8791666666666668 | 0 |
| 0.8798611111111111 | 0 |
| 0.8805555555555555 | 0 |
| 0.88125 | 0 |
| 0.8819444444444445 | 0 |
| 0.8826388888888889 | 0 |
| 0.8833333333333333 | 0 |
| 0.8840277777777777 | 0 |
| 0.8847222222222223 | 0 |
| 0.8854166666666666 | 0 |
| 0.8861111111111111 | 0 |
| 0.8868055555555556 | 0 |
| 0.8875000000000001 | 0 |
| 0.8881944444444444 | 0 |
| 0.8888888888888888 | 0 |
| 0.8895833333333334 | 0 |
| 0.8902777777777778 | 0 |
| 0.8909722222222222 | 0 |
| 0.8916666666666666 | 0 |
| 0.8923611111111112 | 0 |
| 0.8930555555555556 | 0 |
| 0.8937499999999999 | 0 |
| 0.8944444444444444 | 0 |
| 0.8951388888888889 | 0 |
| 0.8958333333333334 | 0 |
| 0.8965277777777777 | 0 |
| 0.8972222222222223 | 0 |
| 0.8979166666666667 | 0 |
| 0.8986111111111111 | 0 |
| 0.8993055555555555 | 0 |
| 0.9 | 0 |
| 0.9006944444444445 | 0 |
| 0.9013888888888889 | 0 |
| 0.9020833333333332 | 0 |
| 0.9027777777777778 | 0 |
| 0.9034722222222222 | 0 |
| 0.9041666666666667 | 0 |
| 0.904861111111111 | 0 |
| 0.9055555555555556 | 0 |
| 0.90625 | 0 |
| 0.9069444444444444 | 0 |
| 0.907638888888889 | 0 |
| 0.9083333333333333 | 0 |
| 0.9090277777777778 | 0 |
| 0.9097222222222222 | 0 |
| 0.9104166666666668 | 0 |
| 0.9111111111111111 | 0 |
| 0.9118055555555555 | 0 |
| 0.9125 | 0 |
| 0.9131944444444445 | 0 |
| 0.9138888888888889 | 0 |
| 0.9145833333333333 | 0 |
| 0.9152777777777777 | 0 |
| 0.9159722222222223 | 0 |
| 0.9166666666666666 | 0 |
| 0.9173611111111111 | 0 |
| 0.9180555555555556 | 0 |
| 0.9187500000000001 | 0 |
| 0.9194444444444444 | 0 |
| 0.9201388888888888 | 0 |
| 0.9208333333333334 | 0 |
| 0.9215277777777778 | 0 |
| 0.9222222222222222 | 0 |
| 0.9229166666666666 | 0 |
| 0.9236111111111112 | 0 |
| 0.9243055555555556 | 0 |
| 0.9249999999999999 | 0 |
| 0.9256944444444444 | 0 |
| 0.9263888888888889 | 0 |
| 0.9270833333333334 | 0 |
| 0.9277777777777777 | 0 |
| 0.9284722222222223 | 0 |
| 0.9291666666666667 | 0 |
| 0.9298611111111111 | 0 |
| 0.9305555555555555 | 0 |
| 0.93125 | 0 |
| 0.9319444444444445 | 0 |
| 0.9326388888888889 | 0 |
| 0.9333333333333332 | 0 |
| 0.9340277777777778 | 0 |
| 0.9347222222222222 | 0 |
| 0.9354166666666667 | 0 |
| 0.936111111111111 | 0 |
| 0.9368055555555556 | 0 |
| 0.9375 | 0 |
| 0.9381944444444444 | 0 |
| 0.938888888888889 | 0 |
| 0.9395833333333333 | 0 |
| 0.9402777777777778 | 0 |
| 0.9409722222222222 | 0 |
| 0.9416666666666668 | 0 |
| 0.9423611111111111 | 0 |
| 0.9430555555555555 | 0 |
| 0.94375 | 0 |
| 0.9444444444444445 | 0 |
| 0.9451388888888889 | 0 |
| 0.9458333333333333 | 0 |
| 0.9465277777777777 | 0 |
| 0.9472222222222223 | 0 |
| 0.9479166666666666 | 0 |
| 0.9486111111111111 | 0 |
| 0.9493055555555556 | 0 |
| 0.9500000000000001 | 0 |
| 0.9506944444444444 | 0 |
| 0.9513888888888888 | 0 |
| 0.9520833333333334 | 0 |
| 0.9527777777777778 | 0 |
| 0.9534722222222222 | 0 |
| 0.9541666666666666 | 0 |
| 0.9548611111111112 | 0 |
| 0.9555555555555556 | 0 |
| 0.9562499999999999 | 0 |
| 0.9569444444444444 | 0 |
| 0.9576388888888889 | 0 |
| 0.9583333333333334 | 0 |
| 0.9590277777777777 | 0 |
| 0.9597222222222223 | 0 |
| 0.9604166666666667 | 0 |
| 0.9611111111111111 | 0 |
| 0.9618055555555555 | 0 |
| 0.9625 | 0 |
| 0.9631944444444445 | 0 |
| 0.9638888888888889 | 0 |
| 0.9645833333333332 | 0 |
| 0.9652777777777778 | 0 |
| 0.9659722222222222 | 0 |
| 0.9666666666666667 | 0 |
| 0.967361111111111 | 0 |
| 0.9680555555555556 | 0 |
| 0.96875 | 0 |
| 0.9694444444444444 | 0 |
| 0.970138888888889 | 0 |
| 0.9708333333333333 | 0 |
| 0.9715277777777778 | 0 |
| 0.9722222222222222 | 0 |
| 0.9729166666666668 | 0 |
| 0.9736111111111111 | 0 |
| 0.9743055555555555 | 0 |
| 0.975 | 0 |
| 0.9756944444444445 | 0 |
| 0.9763888888888889 | 0 |
| 0.9770833333333333 | 0 |
| 0.9777777777777777 | 0 |
| 0.9784722222222223 | 0 |
| 0.9791666666666666 | 0 |
| 0.9798611111111111 | 0 |
| 0.9805555555555556 | 0 |
| 0.9812500000000001 | 0 |
| 0.9819444444444444 | 0 |
| 0.9826388888888888 | 0 |
| 0.9833333333333334 | 0 |
| 0.9840277777777778 | 0 |
| 0.9847222222222222 | 0 |
| 0.9854166666666666 | 0 |
| 0.9861111111111112 | 0 |
| 0.9868055555555556 | 0 |
| 0.9874999999999999 | 0 |
| 0.9881944444444444 | 0 |
| 0.9888888888888889 | 0 |
| 0.9895833333333334 | 0 |
| 0.9902777777777777 | 0 |
| 0.9909722222222223 | 0 |
| 0.9916666666666667 | 0 |
| 0.9923611111111111 | 0 |
| 0.9930555555555555 | 0 |
| 0.99375 | 0 |
| 0.9944444444444445 | 0 |
| 0.9951388888888889 | 0 |
| 0.9958333333333332 | 0 |
| 0.9965277777777778 | 0 |
| 0.9972222222222222 | 0 |
| 0.9979166666666667 | 0 |
| 0.998611111111111 | 0 |
| 0.9993055555555556 | 0 |